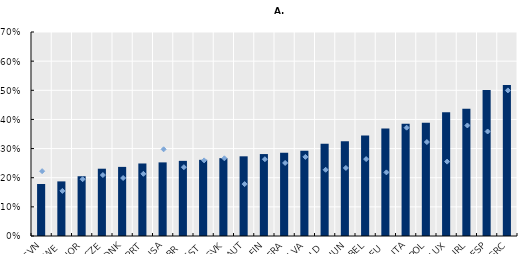
| Category | Mid-1990s |
|---|---|
| SVN | 0.179 |
| SWE | 0.187 |
| NOR | 0.205 |
| CZE | 0.231 |
| DNK | 0.237 |
| PRT | 0.249 |
| USA | 0.253 |
| GBR | 0.258 |
| EST | 0.261 |
| SVK | 0.267 |
| AUT | 0.273 |
| FIN | 0.281 |
| FRA | 0.286 |
| LVA | 0.293 |
| NLD | 0.317 |
| HUN | 0.325 |
| BEL | 0.345 |
| DEU | 0.369 |
| ITA | 0.385 |
| POL | 0.389 |
| LUX | 0.425 |
| IRL | 0.437 |
| ESP | 0.501 |
| GRC | 0.518 |